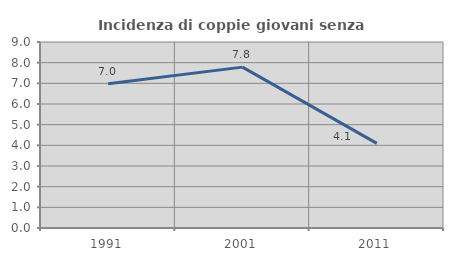
| Category | Incidenza di coppie giovani senza figli |
|---|---|
| 1991.0 | 6.977 |
| 2001.0 | 7.784 |
| 2011.0 | 4.094 |